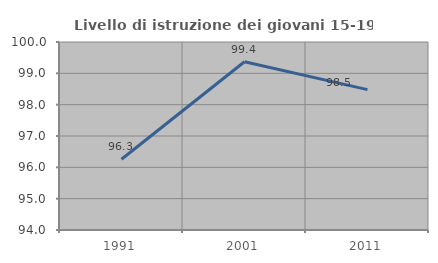
| Category | Livello di istruzione dei giovani 15-19 anni |
|---|---|
| 1991.0 | 96.257 |
| 2001.0 | 99.369 |
| 2011.0 | 98.48 |